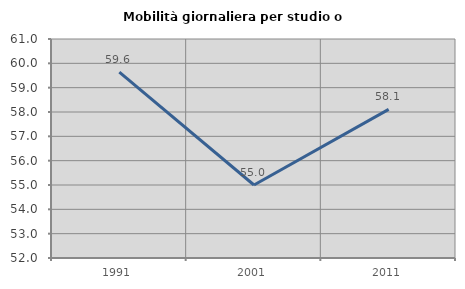
| Category | Mobilità giornaliera per studio o lavoro |
|---|---|
| 1991.0 | 59.639 |
| 2001.0 | 55 |
| 2011.0 | 58.108 |